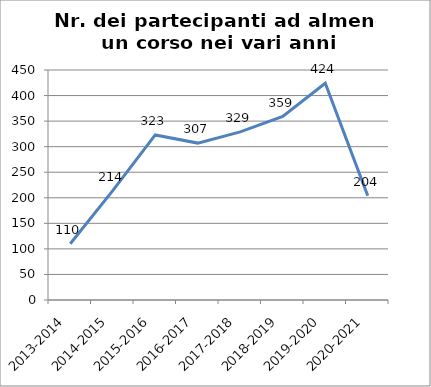
| Category | Nr. Partecipanti ad almeno un Corso |
|---|---|
| 2013-2014 | 110 |
| 2014-2015 | 214 |
| 2015-2016 | 323 |
| 2016-2017 | 307 |
| 2017-2018 | 329 |
| 2018-2019 | 359 |
| 2019-2020 | 424 |
| 2020-2021 | 204 |